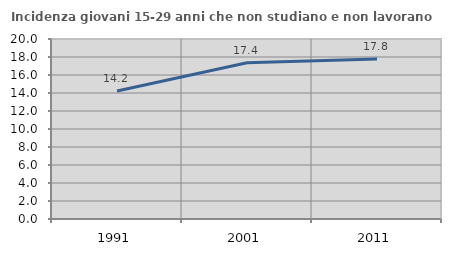
| Category | Incidenza giovani 15-29 anni che non studiano e non lavorano  |
|---|---|
| 1991.0 | 14.22 |
| 2001.0 | 17.352 |
| 2011.0 | 17.766 |